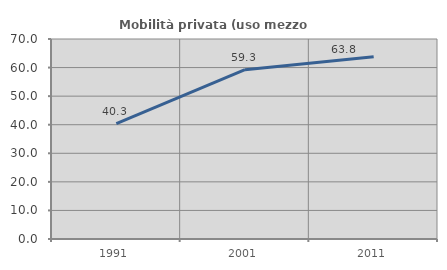
| Category | Mobilità privata (uso mezzo privato) |
|---|---|
| 1991.0 | 40.344 |
| 2001.0 | 59.252 |
| 2011.0 | 63.787 |